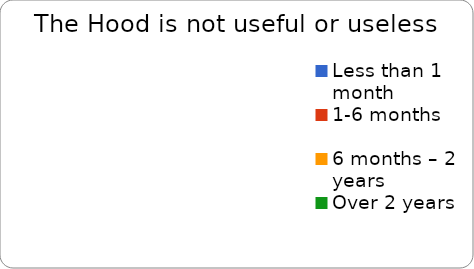
| Category | Neutral |
|---|---|
| Less than 1 month | 0 |
| 1-6 months | 0 |
| 6 months – 2 years | 0 |
| Over 2 years | 0 |